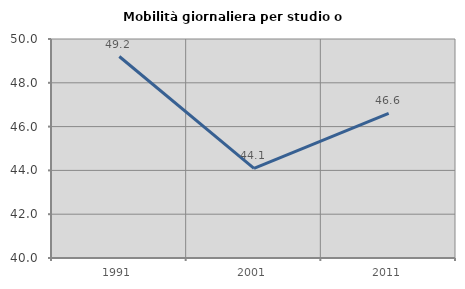
| Category | Mobilità giornaliera per studio o lavoro |
|---|---|
| 1991.0 | 49.201 |
| 2001.0 | 44.096 |
| 2011.0 | 46.605 |